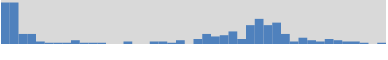
| Category | 33 |
|---|---|
| 244.429550170898 | 33 |
| 466.4260331974469 | 33 |
| 688.4225162239958 | 8 |
| 910.4189992505446 | 8 |
| 1132.4154822770936 | 2 |
| 1354.4119653036425 | 1 |
| 1576.4084483301915 | 1 |
| 1798.4049313567405 | 1 |
| 2020.4014143832894 | 3 |
| 2242.397897409838 | 1 |
| 2464.394380436387 | 1 |
| 2686.390863462936 | 1 |
| 2908.387346489485 | 0 |
| 3130.383829516034 | 0 |
| 3352.380312542583 | 2 |
| 3574.376795569132 | 0 |
| 3796.373278595681 | 0 |
| 4018.36976162223 | 2 |
| 4240.366244648779 | 2 |
| 4462.362727675328 | 1 |
| 4684.359210701877 | 3 |
| 4906.355693728426 | 0 |
| 5128.352176754975 | 4 |
| 5350.348659781524 | 8 |
| 5572.3451428080725 | 6 |
| 5794.3416258346215 | 7 |
| 6016.33810886117 | 10 |
| 6238.334591887719 | 4 |
| 6460.331074914268 | 15 |
| 6682.327557940817 | 20 |
| 6904.324040967366 | 15 |
| 7126.320523993915 | 17 |
| 7348.317007020464 | 8 |
| 7570.313490047013 | 2 |
| 7792.309973073562 | 5 |
| 8014.306456100111 | 3 |
| 8236.30293912666 | 2 |
| 8458.299422153208 | 4 |
| 8680.295905179757 | 3 |
| 8902.292388206306 | 2 |
| 9124.288871232855 | 2 |
| 9346.285354259404 | 1 |
| 9568.281837285953 | 0 |
| 9790.2783203125 | 1 |